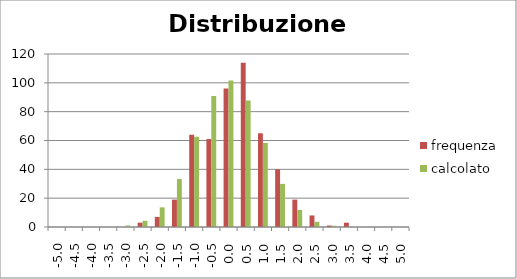
| Category | frequenza | calcolato |
|---|---|---|
| -5.0 | 0 | 0 |
| -4.5 | 0 | 0.003 |
| -4.0 | 0 | 0.028 |
| -3.5 | 0 | 0.196 |
| -3.0 | 0 | 1.045 |
| -2.5 | 3 | 4.296 |
| -2.0 | 7 | 13.613 |
| -1.5 | 19 | 33.249 |
| -1.0 | 64 | 62.606 |
| -0.5 | 61 | 90.875 |
| 0.0 | 96 | 101.689 |
| 0.5 | 114 | 87.72 |
| 1.0 | 65 | 58.334 |
| 1.5 | 40 | 29.905 |
| 2.0 | 19 | 11.818 |
| 2.5 | 8 | 3.601 |
| 3.0 | 1 | 0.846 |
| 3.5 | 3 | 0.153 |
| 4.0 | 0 | 0.021 |
| 4.5 | 0 | 0.002 |
| 5.0 | 0 | 0 |